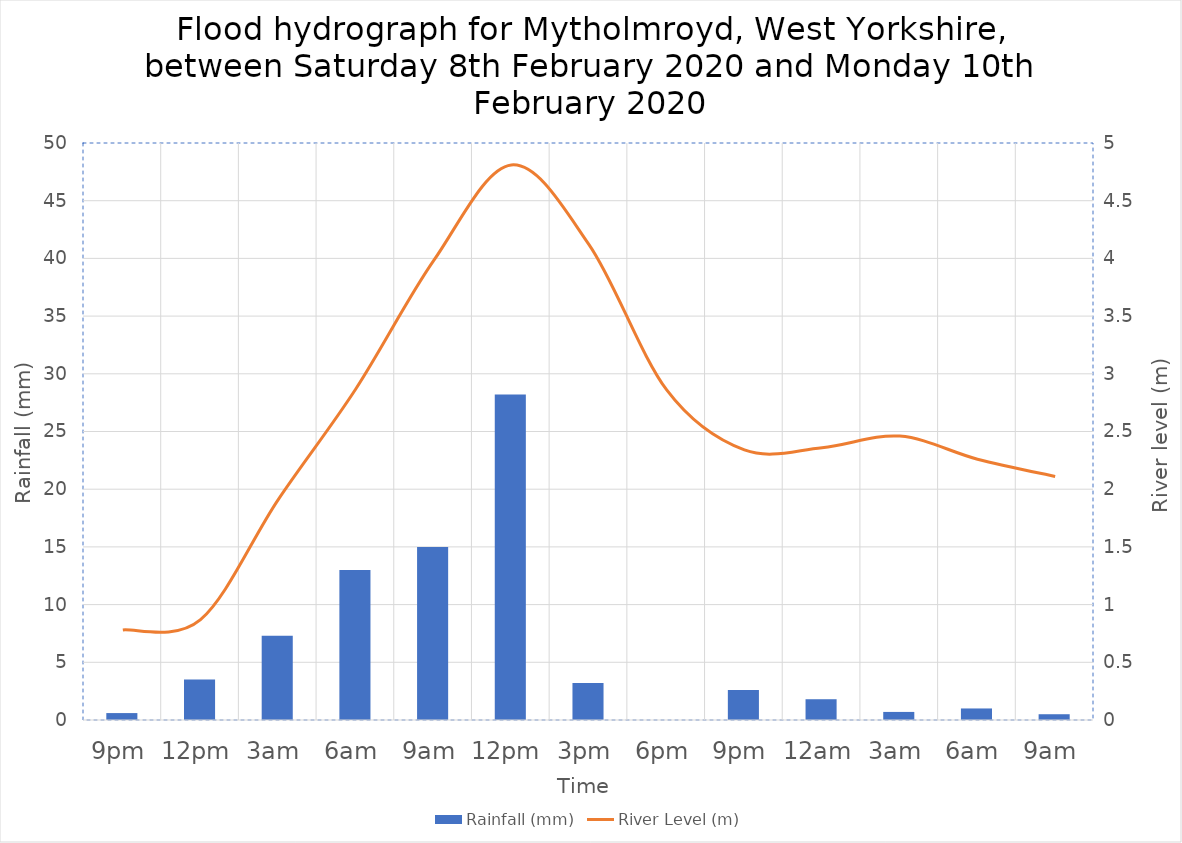
| Category | Rainfall (mm) |
|---|---|
| 9pm | 0.6 |
| 12pm | 3.5 |
| 3am | 7.3 |
| 6am | 13 |
| 9am | 15 |
| 12pm | 28.2 |
| 3pm | 3.2 |
| 6pm | 0 |
| 9pm | 2.6 |
| 12am | 1.8 |
| 3am | 0.7 |
| 6am | 1 |
| 9am | 0.5 |